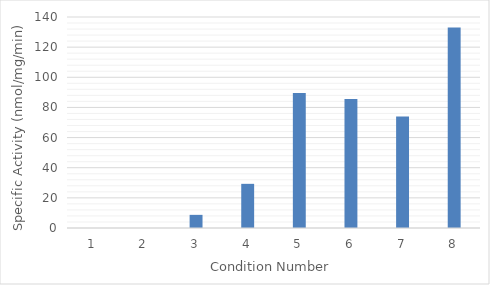
| Category | Specific Activity |
|---|---|
| 0 | 0 |
| 1 | 0 |
| 2 | 8.719 |
| 3 | 29.305 |
| 4 | 89.494 |
| 5 | 85.551 |
| 6 | 74.01 |
| 7 | 133.078 |